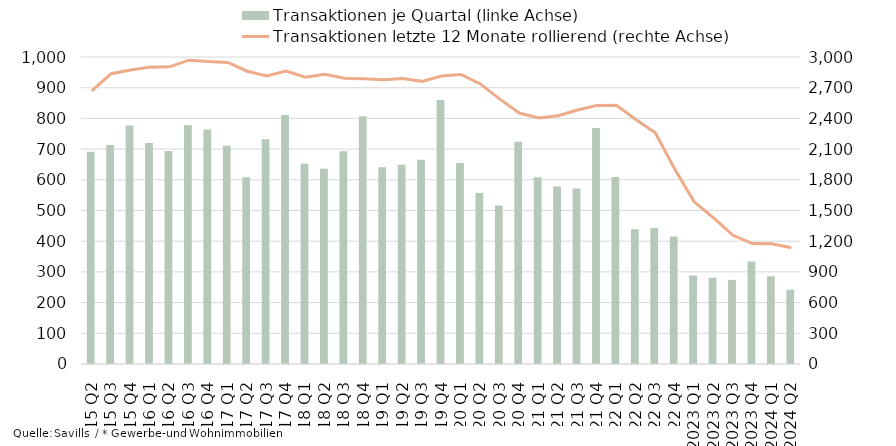
| Category | Transaktionen je Quartal (linke Achse) |
|---|---|
| 2015 Q2 | 691 |
| 2015 Q3 | 713 |
| 2015 Q4 | 777 |
| 2016 Q1 | 720 |
| 2016 Q2 | 694 |
| 2016 Q3 | 778 |
| 2016 Q4 | 764 |
| 2017 Q1 | 711 |
| 2017 Q2 | 608 |
| 2017 Q3 | 732 |
| 2017 Q4 | 811 |
| 2018 Q1 | 652 |
| 2018 Q2 | 636 |
| 2018 Q3 | 693 |
| 2018 Q4 | 807 |
| 2019 Q1 | 641 |
| 2019 Q2 | 649 |
| 2019 Q3 | 665 |
| 2019 Q4 | 860 |
| 2020 Q1 | 655 |
| 2020 Q2 | 557 |
| 2020 Q3 | 516 |
| 2020 Q4 | 724 |
| 2021 Q1 | 608 |
| 2021 Q2 | 578 |
| 2021 Q3 | 572 |
| 2021 Q4 | 769 |
| 2022 Q1 | 609 |
| 2022 Q2 | 439 |
| 2022 Q3 | 443 |
| 2022 Q4 | 415 |
| 2023 Q1 | 288 |
| 2023 Q2 | 281 |
| 2023 Q3 | 274 |
| 2023 Q4 | 334 |
| 2024 Q1 | 286 |
| 2024 Q2 | 242 |